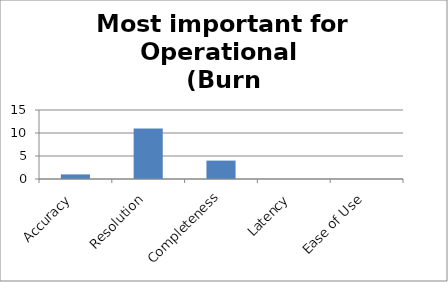
| Category | Most important for Operational (Burn scar/Landslide) |
|---|---|
| Accuracy | 1 |
| Resolution | 11 |
| Completeness | 4 |
| Latency | 0 |
| Ease of Use | 0 |